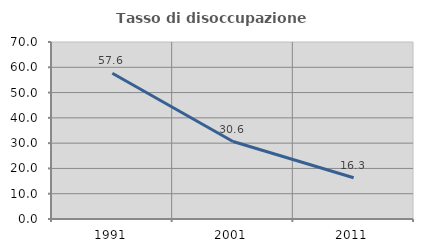
| Category | Tasso di disoccupazione giovanile  |
|---|---|
| 1991.0 | 57.627 |
| 2001.0 | 30.645 |
| 2011.0 | 16.327 |